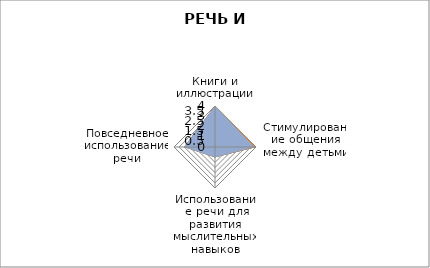
| Category | Series 0 | Series 1 | Series 2 | Series 3 | Series 4 | Series 5 | Series 6 |
|---|---|---|---|---|---|---|---|
| Книги и иллюстрации | 4 | 4 | 4 | 4 | 4 | 4 | 4 |
| Стимулирование общения между детьми | 3 | 4 | 4 | 4 | 4 | 4 | 3.833 |
| Использование речи для развития мыслительных навыков | 1 | 1 | 1 | 1 | 1 | 1 | 1 |
| Повседневное использование речи | 3 | 3 | 3 | 3 | 3 | 3 | 3 |